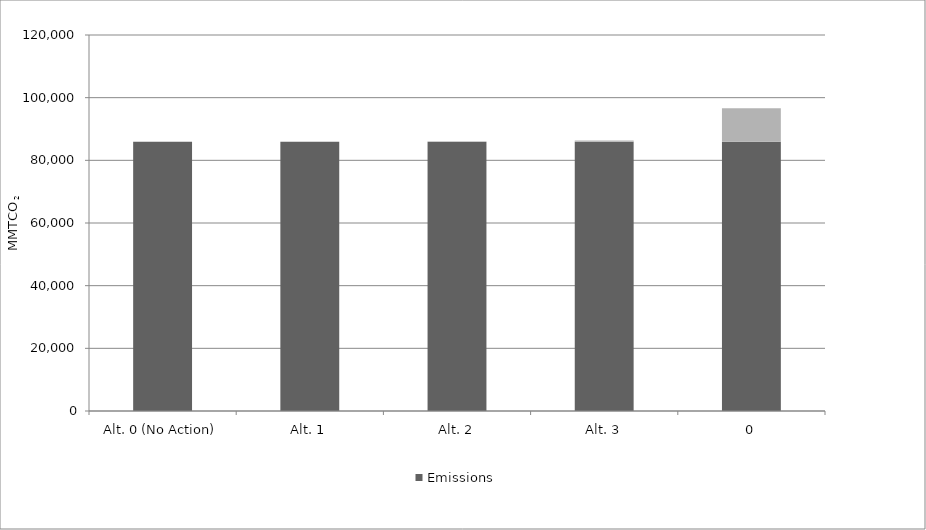
| Category | Emissions | Emissions Difference Compared to No Action Alternative |
|---|---|---|
| Alt. 0 (No Action) | 85900 | 0 |
| Alt. 1 | 85900 | 0 |
| Alt. 2 | 85900 | 100 |
| Alt. 3 | 85900 | 400 |
| 0 | 85900 | 10700 |